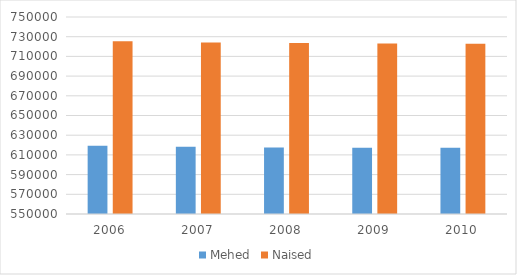
| Category | Mehed | Naised |
|---|---|---|
| 2006.0 | 619299 | 725385 |
| 2007.0 | 618245 | 724164 |
| 2008.0 | 617410 | 723525 |
| 2009.0 | 617299 | 723116 |
| 2010.0 | 617323 | 722804 |